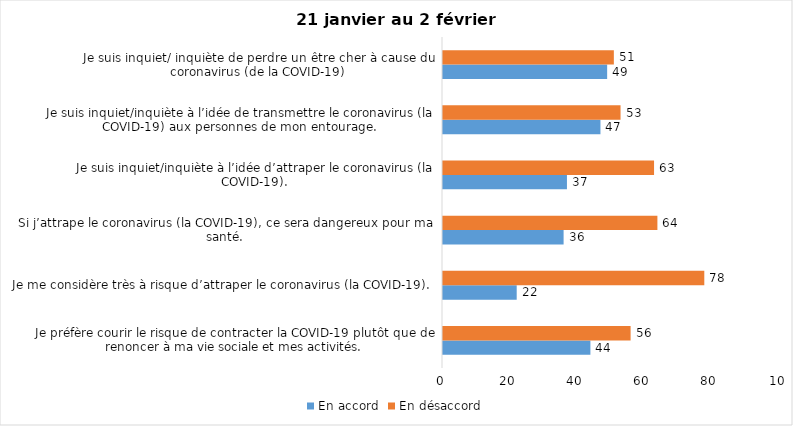
| Category | En accord | En désaccord |
|---|---|---|
| Je préfère courir le risque de contracter la COVID-19 plutôt que de renoncer à ma vie sociale et mes activités. | 44 | 56 |
| Je me considère très à risque d’attraper le coronavirus (la COVID-19). | 22 | 78 |
| Si j’attrape le coronavirus (la COVID-19), ce sera dangereux pour ma santé. | 36 | 64 |
| Je suis inquiet/inquiète à l’idée d’attraper le coronavirus (la COVID-19). | 37 | 63 |
| Je suis inquiet/inquiète à l’idée de transmettre le coronavirus (la COVID-19) aux personnes de mon entourage. | 47 | 53 |
| Je suis inquiet/ inquiète de perdre un être cher à cause du coronavirus (de la COVID-19) | 49 | 51 |